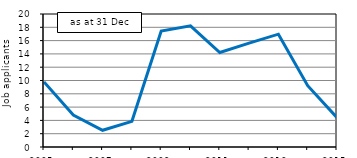
| Category | Series 1 |
|---|---|
| 2005.0 | 9.785 |
| 2006.0 | 4.801 |
| 2007.0 | 2.516 |
| 2008.0 | 3.863 |
| 2009.0 | 17.433 |
| 2010.0 | 18.23 |
| 2011.0 | 14.209 |
| 2012.0 | 15.628 |
| 2013.0 | 16.966 |
| 2014.0 | 9.226 |
| 2015.0 | 4.419 |